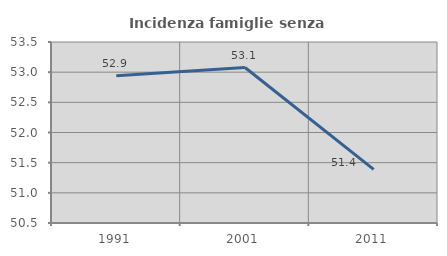
| Category | Incidenza famiglie senza nuclei |
|---|---|
| 1991.0 | 52.941 |
| 2001.0 | 53.077 |
| 2011.0 | 51.389 |